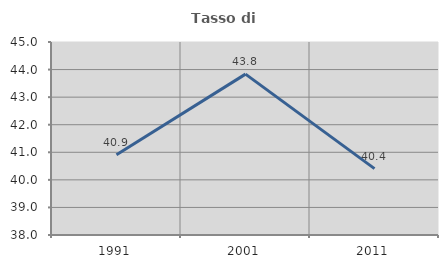
| Category | Tasso di occupazione   |
|---|---|
| 1991.0 | 40.909 |
| 2001.0 | 43.836 |
| 2011.0 | 40.408 |